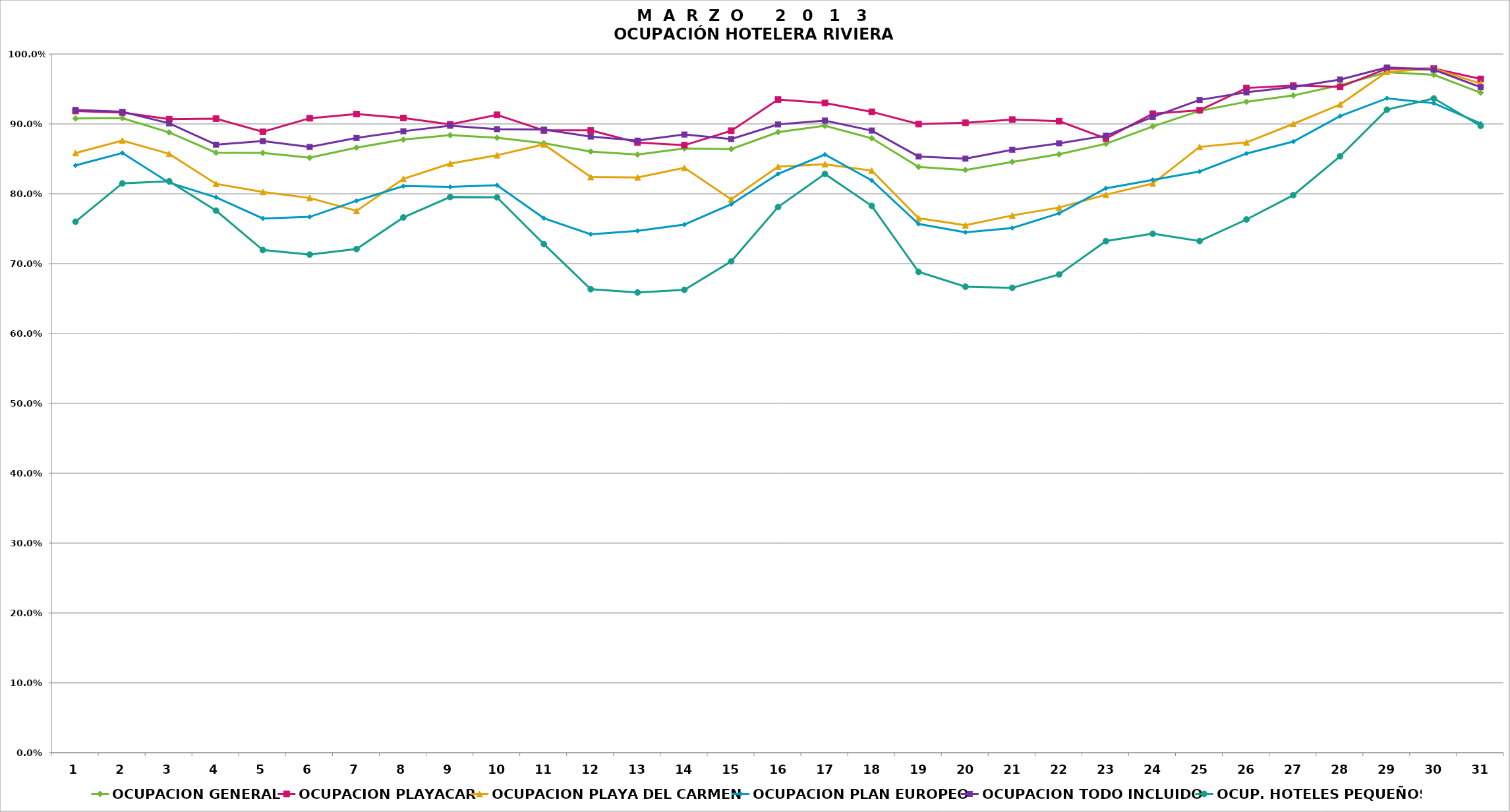
| Category | OCUPACION GENERAL | OCUPACION PLAYACAR | OCUPACION PLAYA DEL CARMEN | OCUPACION PLAN EUROPEO | OCUPACION TODO INCLUIDO | OCUP. HOTELES PEQUEÑOS |
|---|---|---|---|---|---|---|
| 1.0 | 0.908 | 0.918 | 0.858 | 0.84 | 0.92 | 0.76 |
| 2.0 | 0.908 | 0.916 | 0.876 | 0.858 | 0.917 | 0.815 |
| 3.0 | 0.888 | 0.907 | 0.857 | 0.816 | 0.901 | 0.818 |
| 4.0 | 0.859 | 0.908 | 0.814 | 0.795 | 0.87 | 0.776 |
| 5.0 | 0.858 | 0.889 | 0.803 | 0.765 | 0.875 | 0.72 |
| 6.0 | 0.852 | 0.908 | 0.794 | 0.767 | 0.867 | 0.713 |
| 7.0 | 0.866 | 0.914 | 0.776 | 0.79 | 0.88 | 0.721 |
| 8.0 | 0.878 | 0.908 | 0.821 | 0.811 | 0.89 | 0.766 |
| 9.0 | 0.884 | 0.899 | 0.843 | 0.81 | 0.897 | 0.795 |
| 10.0 | 0.88 | 0.913 | 0.855 | 0.812 | 0.892 | 0.795 |
| 11.0 | 0.872 | 0.891 | 0.871 | 0.765 | 0.892 | 0.728 |
| 12.0 | 0.86 | 0.891 | 0.824 | 0.742 | 0.882 | 0.663 |
| 13.0 | 0.856 | 0.873 | 0.823 | 0.747 | 0.876 | 0.659 |
| 14.0 | 0.865 | 0.87 | 0.837 | 0.756 | 0.885 | 0.662 |
| 15.0 | 0.864 | 0.89 | 0.792 | 0.785 | 0.878 | 0.703 |
| 16.0 | 0.888 | 0.935 | 0.839 | 0.828 | 0.899 | 0.781 |
| 17.0 | 0.897 | 0.93 | 0.842 | 0.856 | 0.905 | 0.828 |
| 18.0 | 0.879 | 0.917 | 0.833 | 0.819 | 0.89 | 0.783 |
| 19.0 | 0.838 | 0.9 | 0.765 | 0.757 | 0.853 | 0.688 |
| 20.0 | 0.834 | 0.902 | 0.755 | 0.745 | 0.85 | 0.667 |
| 21.0 | 0.846 | 0.906 | 0.769 | 0.751 | 0.863 | 0.665 |
| 22.0 | 0.857 | 0.904 | 0.78 | 0.772 | 0.872 | 0.684 |
| 23.0 | 0.872 | 0.879 | 0.799 | 0.808 | 0.883 | 0.732 |
| 24.0 | 0.896 | 0.915 | 0.815 | 0.82 | 0.91 | 0.743 |
| 25.0 | 0.919 | 0.92 | 0.867 | 0.832 | 0.934 | 0.732 |
| 26.0 | 0.932 | 0.951 | 0.874 | 0.858 | 0.945 | 0.763 |
| 27.0 | 0.941 | 0.955 | 0.9 | 0.875 | 0.953 | 0.798 |
| 28.0 | 0.956 | 0.953 | 0.928 | 0.911 | 0.964 | 0.854 |
| 29.0 | 0.974 | 0.979 | 0.974 | 0.937 | 0.981 | 0.92 |
| 30.0 | 0.97 | 0.979 | 0.979 | 0.93 | 0.978 | 0.936 |
| 31.0 | 0.945 | 0.964 | 0.958 | 0.9 | 0.953 | 0.897 |